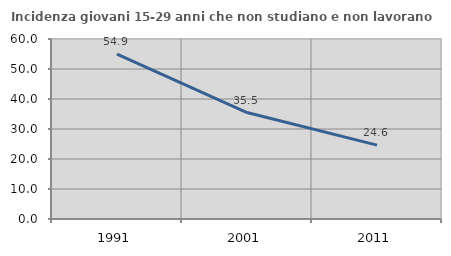
| Category | Incidenza giovani 15-29 anni che non studiano e non lavorano  |
|---|---|
| 1991.0 | 54.936 |
| 2001.0 | 35.484 |
| 2011.0 | 24.638 |